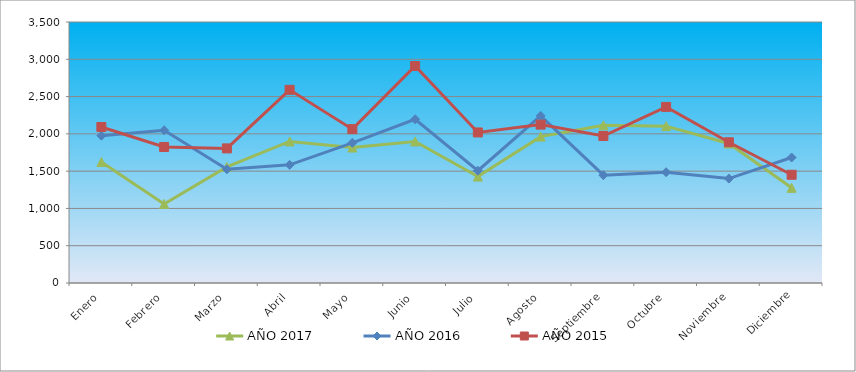
| Category | AÑO 2017 | AÑO 2016 | AÑO 2015 |
|---|---|---|---|
| Enero | 1622.342 | 1975.865 | 2091.615 |
| Febrero | 1059.93 | 2048.249 | 1823.787 |
| Marzo | 1557.448 | 1524.95 | 1805.056 |
| Abril | 1898.14 | 1584.108 | 2590.324 |
| Mayo | 1817.023 | 1879.896 | 2063.069 |
| Junio | 1898.14 | 2195.402 | 2910.159 |
| Julio | 1427.661 | 1505.231 | 2018.86 |
| Agosto | 1963.034 | 2241.414 | 2123.772 |
| Septiembre | 2114.452 | 1446.073 | 1971.394 |
| Octubre | 2103.637 | 1485.512 | 2361.597 |
| Noviembre | 1871.101 | 1400.062 | 1887.04 |
| Diciembre | 1276.242 | 1682.704 | 1451.46 |